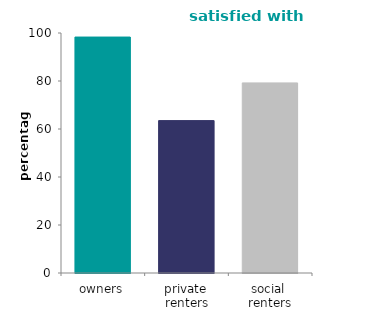
| Category | Satisfied with tenure |
|---|---|
| owners | 98.312 |
| private 
renters | 63.491 |
| social 
renters | 79.203 |